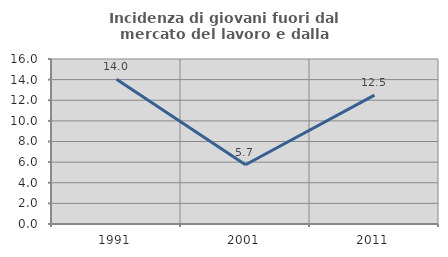
| Category | Incidenza di giovani fuori dal mercato del lavoro e dalla formazione  |
|---|---|
| 1991.0 | 14.035 |
| 2001.0 | 5.747 |
| 2011.0 | 12.5 |